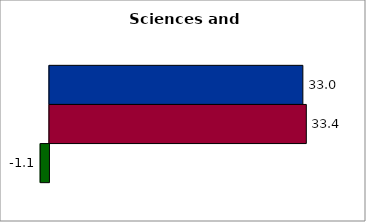
| Category | 50 states and D.C. | SREB states | State |
|---|---|---|---|
| 0 | 32.96 | 33.41 | -1.143 |